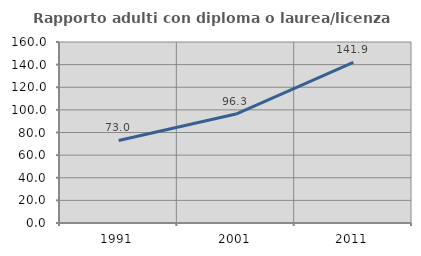
| Category | Rapporto adulti con diploma o laurea/licenza media  |
|---|---|
| 1991.0 | 72.973 |
| 2001.0 | 96.324 |
| 2011.0 | 141.912 |